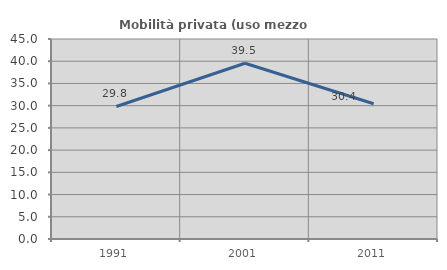
| Category | Mobilità privata (uso mezzo privato) |
|---|---|
| 1991.0 | 29.817 |
| 2001.0 | 39.548 |
| 2011.0 | 30.435 |